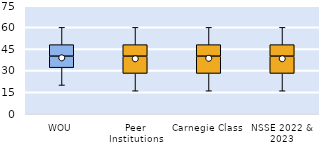
| Category | 25th | 50th | 75th |
|---|---|---|---|
| WOU | 32 | 8 | 8 |
| Peer Institutions | 28 | 12 | 8 |
| Carnegie Class | 28 | 12 | 8 |
| NSSE 2022 & 2023 | 28 | 12 | 8 |